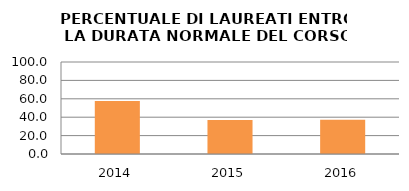
| Category | 2014 2015 2016 |
|---|---|
| 2014.0 | 57.692 |
| 2015.0 | 36.957 |
| 2016.0 | 37.209 |